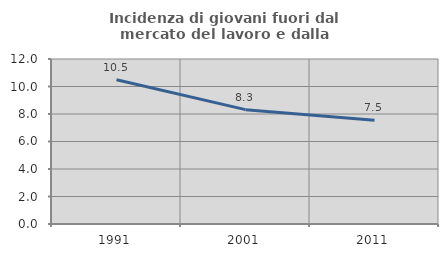
| Category | Incidenza di giovani fuori dal mercato del lavoro e dalla formazione  |
|---|---|
| 1991.0 | 10.495 |
| 2001.0 | 8.316 |
| 2011.0 | 7.543 |